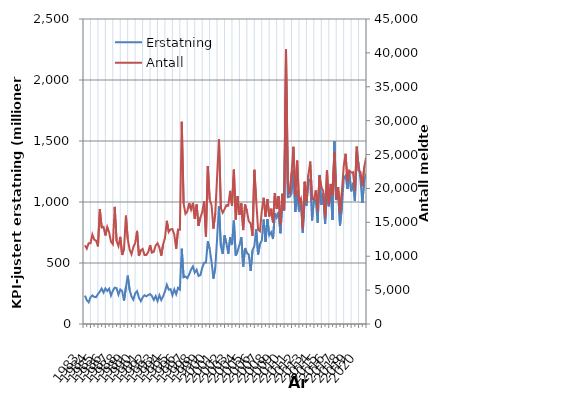
| Category | Erstatning |
|---|---|
| 1983.0 | 232.937 |
| nan | 195.121 |
| nan | 178.438 |
| nan | 218.579 |
| 1984.0 | 234.389 |
| nan | 221.715 |
| nan | 219.826 |
| nan | 245.877 |
| 1985.0 | 265.702 |
| nan | 290.42 |
| nan | 257.346 |
| nan | 291.865 |
| 1986.0 | 270.604 |
| nan | 289.558 |
| nan | 233.055 |
| nan | 272.728 |
| 1987.0 | 297.95 |
| nan | 294.021 |
| nan | 240.61 |
| nan | 283.085 |
| 1988.0 | 269.44 |
| nan | 192.069 |
| nan | 299.153 |
| nan | 396.293 |
| 1989.0 | 279.972 |
| nan | 226.285 |
| nan | 199.112 |
| nan | 251.201 |
| 1990.0 | 268.971 |
| nan | 216.388 |
| nan | 187.666 |
| nan | 218.436 |
| 1991.0 | 235.713 |
| nan | 226.637 |
| nan | 237.191 |
| nan | 245.226 |
| 1992.0 | 229.086 |
| nan | 197.393 |
| nan | 228.083 |
| nan | 188.213 |
| 1993.0 | 236.156 |
| nan | 196.535 |
| nan | 227.061 |
| nan | 268.62 |
| 1994.0 | 321.731 |
| nan | 281.266 |
| nan | 285.763 |
| nan | 235.54 |
| 1995.0 | 283.776 |
| nan | 244.132 |
| nan | 296.645 |
| nan | 281.65 |
| 1996.0 | 617.657 |
| nan | 382.464 |
| nan | 389.296 |
| nan | 375.446 |
| 1997.0 | 406.453 |
| nan | 446.013 |
| nan | 472.333 |
| nan | 421.43 |
| 1998.0 | 444.599 |
| nan | 393.872 |
| nan | 400.307 |
| nan | 460.108 |
| 1999.0 | 501.845 |
| nan | 504.283 |
| nan | 678.577 |
| nan | 614.541 |
| 2000.0 | 512.261 |
| nan | 372.014 |
| nan | 461.192 |
| nan | 703.176 |
| 2001.0 | 965.028 |
| nan | 638.852 |
| nan | 573.774 |
| nan | 725.942 |
| 2002.0 | 661.156 |
| nan | 575.27 |
| nan | 710.935 |
| nan | 647.82 |
| 2003.0 | 847.26 |
| nan | 560.178 |
| nan | 595.958 |
| nan | 649.208 |
| 2004.0 | 712.217 |
| nan | 470.87 |
| nan | 622.509 |
| nan | 581.854 |
| 2005.0 | 569.493 |
| nan | 434.602 |
| nan | 603.345 |
| nan | 639.394 |
| 2006.0 | 777.195 |
| nan | 569.965 |
| nan | 655.815 |
| nan | 684.196 |
| 2007.0 | 856.408 |
| nan | 673.317 |
| nan | 860.276 |
| nan | 727.347 |
| 2008.0 | 752.172 |
| nan | 696.322 |
| nan | 909.437 |
| nan | 873.42 |
| 2009.0 | 916.557 |
| nan | 744.098 |
| nan | 982.934 |
| nan | 929.078 |
| 2010.0 | 2038.021 |
| nan | 1039.492 |
| nan | 1044.493 |
| nan | 1068.56 |
| 2011.0 | 1262.842 |
| nan | 918.31 |
| nan | 1094.943 |
| nan | 922.779 |
| 2012.0 | 1022.313 |
| nan | 747.404 |
| nan | 1030.461 |
| nan | 970.277 |
| 2013.0 | 1191.601 |
| nan | 1166.802 |
| nan | 849.019 |
| nan | 1025.516 |
| 2014.0 | 1011.435 |
| nan | 830.588 |
| nan | 1221.838 |
| nan | 976.933 |
| 2015.0 | 1071.822 |
| nan | 820.828 |
| nan | 1086.542 |
| nan | 964.725 |
| 2016.0 | 1109.027 |
| nan | 853.659 |
| nan | 1497.167 |
| nan | 1015.828 |
| 2017.0 | 1088.954 |
| nan | 807.65 |
| nan | 953.843 |
| nan | 1191.034 |
| 2018.0 | 1215.874 |
| nan | 1106.121 |
| nan | 1232.942 |
| nan | 1087.816 |
| 2019.0 | 1157.146 |
| nan | 1008.947 |
| nan | 1404.229 |
| nan | 1307.73 |
| 2020.0 | 1182.332 |
| nan | 993.156 |
| nan | 1172.187 |
| nan | 1232.095 |